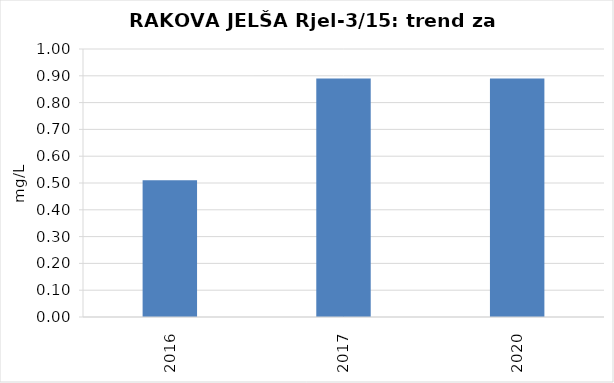
| Category | Vsota |
|---|---|
| 2016 | 0.51 |
| 2017 | 0.89 |
| 2020 | 0.89 |